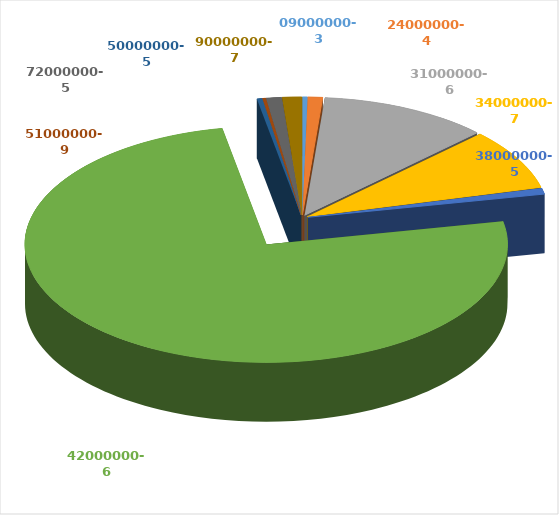
| Category | Series 0 |
|---|---|
| 0 | 539792 |
| 1 | 1534212 |
| 2 | 17529399 |
| 3 | 12889615 |
| 4 | 1294900 |
| 5 | 116357974 |
| 6 | 555000 |
| 7 | 350532 |
| 8 | 1600000 |
| 9 | 2024261 |